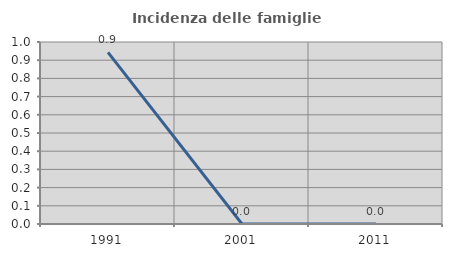
| Category | Incidenza delle famiglie numerose |
|---|---|
| 1991.0 | 0.943 |
| 2001.0 | 0 |
| 2011.0 | 0 |